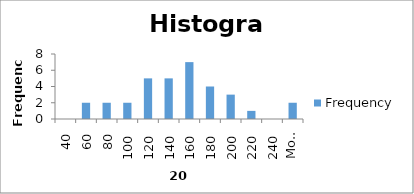
| Category | Frequency |
|---|---|
| 40 | 0 |
| 60 | 2 |
| 80 | 2 |
| 100 | 2 |
| 120 | 5 |
| 140 | 5 |
| 160 | 7 |
| 180 | 4 |
| 200 | 3 |
| 220 | 1 |
| 240 | 0 |
| More | 2 |